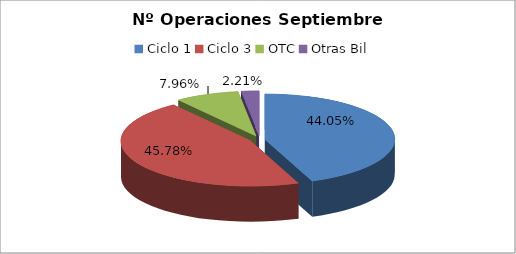
| Category | Series 0 |
|---|---|
| Ciclo 1 | 51316 |
| Ciclo 3 | 53331 |
| OTC | 9278 |
| Otras Bil | 2578 |